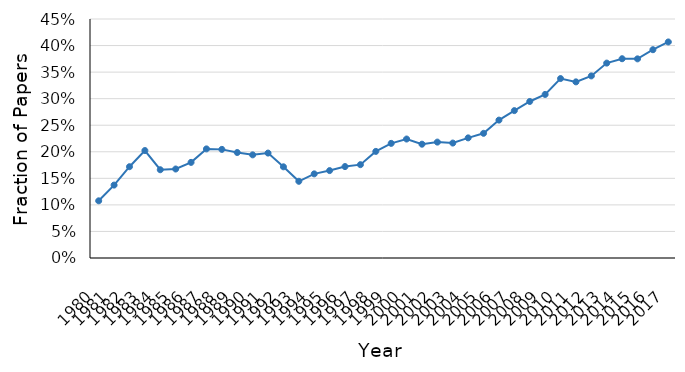
| Category | Behavioral Economics |
|---|---|
| 1980.0 | 0.108 |
| 1981.0 | 0.137 |
| 1982.0 | 0.172 |
| 1983.0 | 0.202 |
| 1984.0 | 0.166 |
| 1985.0 | 0.168 |
| 1986.0 | 0.18 |
| 1987.0 | 0.205 |
| 1988.0 | 0.205 |
| 1989.0 | 0.199 |
| 1990.0 | 0.194 |
| 1991.0 | 0.198 |
| 1992.0 | 0.172 |
| 1993.0 | 0.144 |
| 1994.0 | 0.158 |
| 1995.0 | 0.165 |
| 1996.0 | 0.172 |
| 1997.0 | 0.176 |
| 1998.0 | 0.201 |
| 1999.0 | 0.216 |
| 2000.0 | 0.224 |
| 2001.0 | 0.214 |
| 2002.0 | 0.218 |
| 2003.0 | 0.216 |
| 2004.0 | 0.226 |
| 2005.0 | 0.235 |
| 2006.0 | 0.26 |
| 2007.0 | 0.278 |
| 2008.0 | 0.295 |
| 2009.0 | 0.308 |
| 2010.0 | 0.338 |
| 2011.0 | 0.332 |
| 2012.0 | 0.343 |
| 2013.0 | 0.367 |
| 2014.0 | 0.375 |
| 2015.0 | 0.375 |
| 2016.0 | 0.392 |
| 2017.0 | 0.407 |